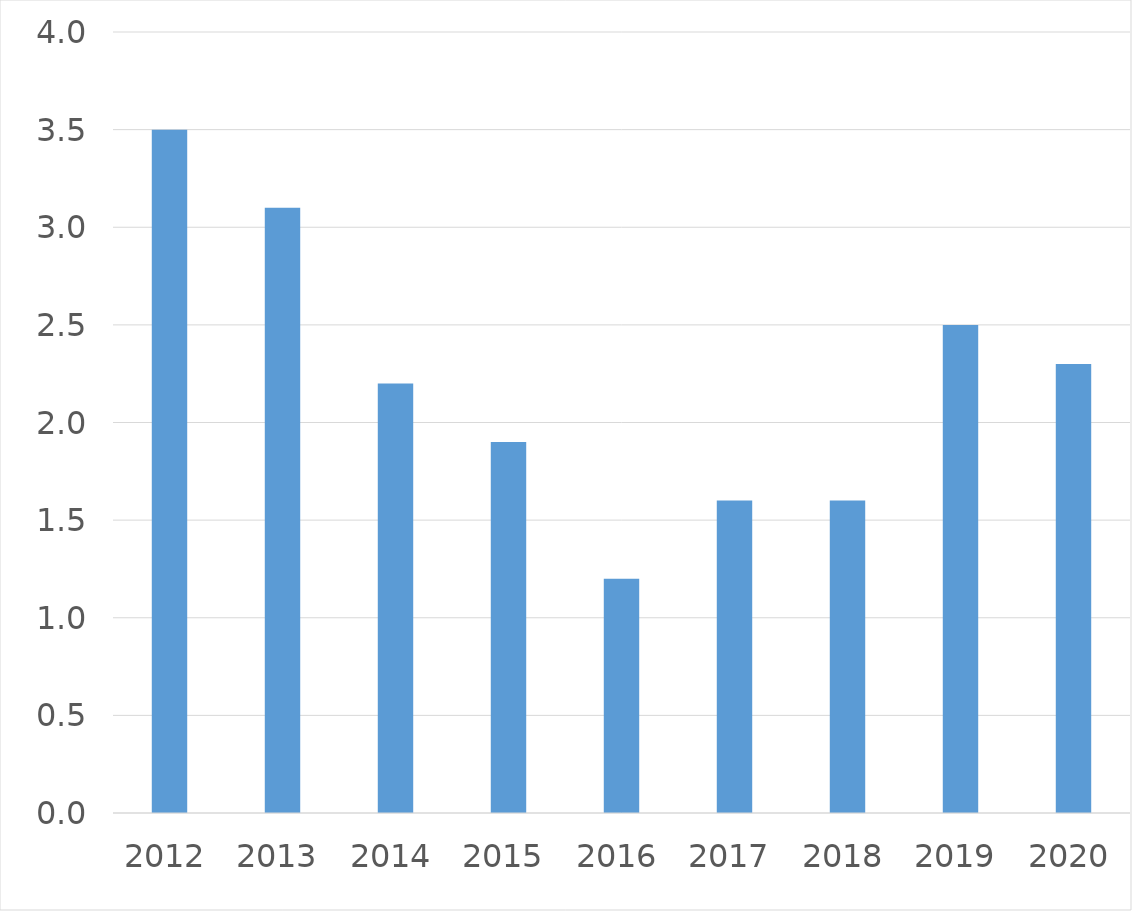
| Category | Series 0 |
|---|---|
| 2012 | 3.5 |
| 2013 | 3.1 |
| 2014 | 2.2 |
| 2015 | 1.9 |
| 2016 | 1.2 |
| 2017 | 1.6 |
| 2018 | 1.6 |
| 2019 | 2.5 |
| 2020 | 2.3 |